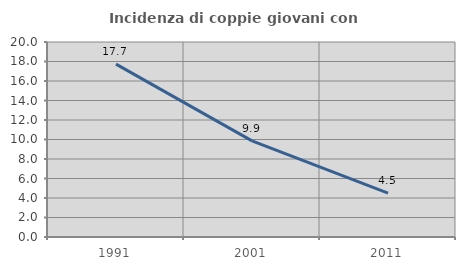
| Category | Incidenza di coppie giovani con figli |
|---|---|
| 1991.0 | 17.736 |
| 2001.0 | 9.856 |
| 2011.0 | 4.491 |